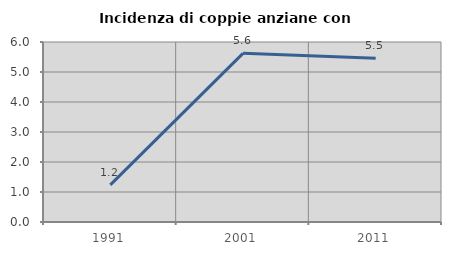
| Category | Incidenza di coppie anziane con figli |
|---|---|
| 1991.0 | 1.237 |
| 2001.0 | 5.622 |
| 2011.0 | 5.455 |